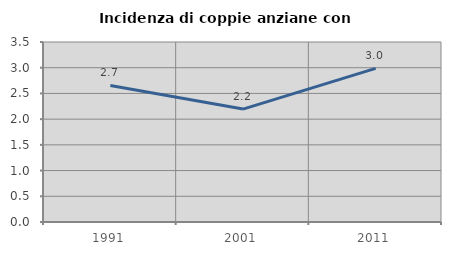
| Category | Incidenza di coppie anziane con figli |
|---|---|
| 1991.0 | 2.655 |
| 2001.0 | 2.196 |
| 2011.0 | 2.988 |